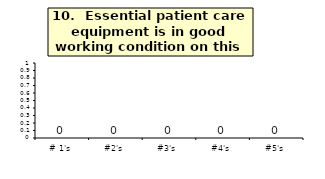
| Category | Q_10 |
|---|---|
| # 1's | 0 |
| #2's | 0 |
| #3's | 0 |
| #4's | 0 |
| #5's | 0 |